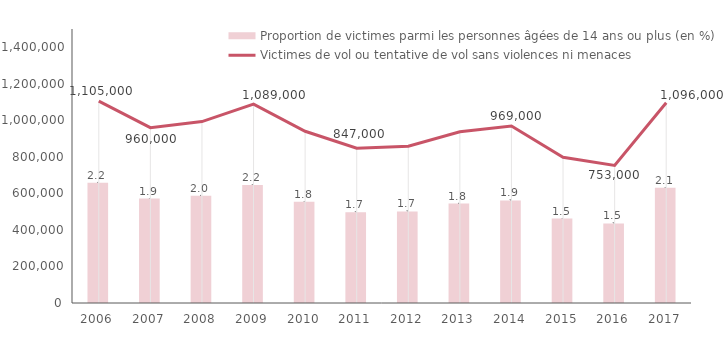
| Category | Proportion de victimes parmi les personnes âgées de 14 ans ou plus (en %) |
|---|---|
| 2006.0 | 2.196 |
| 2007.0 | 1.906 |
| 2008.0 | 1.957 |
| 2009.0 | 2.154 |
| 2010.0 | 1.848 |
| 2011.0 | 1.658 |
| 2012.0 | 1.671 |
| 2013.0 | 1.816 |
| 2014.0 | 1.872 |
| 2015.0 | 1.542 |
| 2016.0 | 1.453 |
| 2017.0 | 2.102 |